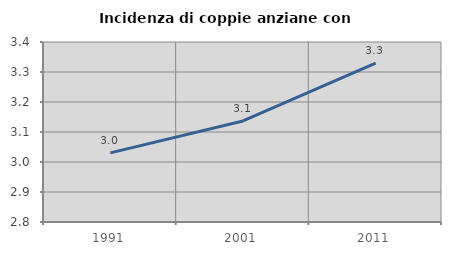
| Category | Incidenza di coppie anziane con figli |
|---|---|
| 1991.0 | 3.03 |
| 2001.0 | 3.137 |
| 2011.0 | 3.33 |